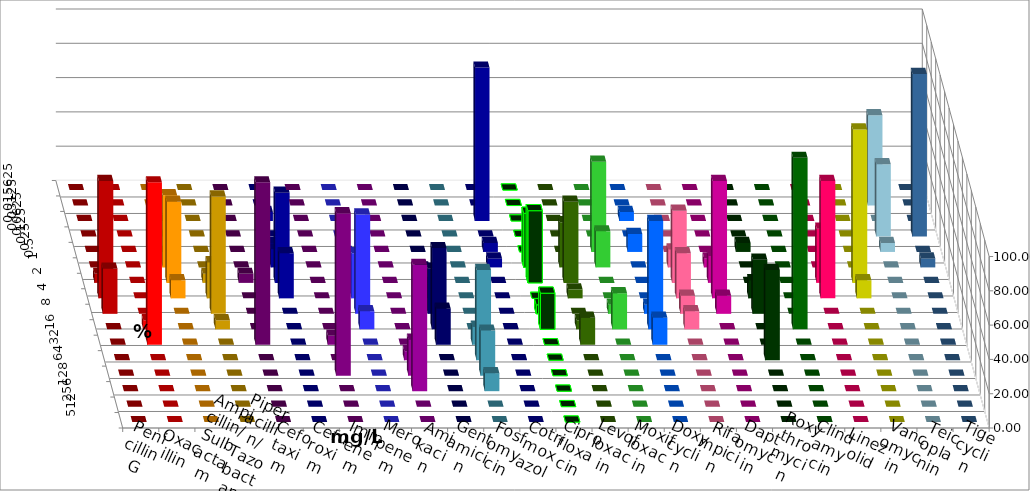
| Category | Penicillin G | Oxacillin | Ampicillin/ Sulbactam | Piperacillin/ Tazobactam | Cefotaxim | Cefuroxim | Imipenem | Meropenem | Amikacin | Gentamicin | Fosfomycin | Cotrimoxazol | Ciprofloxacin | Levofloxacin | Moxifloxacin | Doxycyclin | Rifampicin | Daptomycin | Roxythromycin | Clindamycin | Linezolid | Vancomycin | Teicoplanin | Tigecyclin |
|---|---|---|---|---|---|---|---|---|---|---|---|---|---|---|---|---|---|---|---|---|---|---|---|---|
| 0.015625 | 0 | 0 | 0 | 0 | 0 | 0 | 0 | 0 | 0 | 0 | 0 | 0 | 0 | 0 | 0 | 0 | 0 | 0 | 0 | 0 | 0 | 0 | 0 | 0 |
| 0.03125 | 0 | 0 | 0 | 0 | 0 | 0 | 0 | 0 | 0 | 0 | 0 | 0 | 0 | 0 | 0 | 0 | 0 | 0 | 0 | 0 | 0 | 0 | 0 | 52.632 |
| 0.0625 | 0 | 0 | 0 | 0 | 0 | 0 | 5.263 | 0 | 0 | 0 | 0 | 89.474 | 0 | 0 | 0 | 5.263 | 0 | 0 | 0 | 0 | 0 | 0 | 0 | 0 |
| 0.125 | 0 | 0 | 0 | 0 | 0 | 0 | 0 | 0 | 0 | 0 | 0 | 0 | 0 | 0 | 0 | 0 | 0 | 0 | 0 | 0 | 0 | 0 | 94.737 | 42.105 |
| 0.25 | 0 | 0 | 0 | 0 | 0 | 0 | 5.263 | 0 | 0 | 0 | 0 | 5.263 | 0 | 0 | 52.632 | 10.526 | 0 | 0 | 5.263 | 0 | 0 | 0 | 0 | 5.263 |
| 0.5 | 0 | 0 | 42.105 | 0 | 0 | 0 | 10.526 | 0 | 0 | 0 | 0 | 5.263 | 31.579 | 26.316 | 21.053 | 0 | 10.526 | 5.263 | 0 | 0 | 0 | 0 | 5.263 | 0 |
| 1.0 | 5.263 | 0 | 47.368 | 5.263 | 5.263 | 0 | 52.632 | 5.263 | 0 | 0 | 0 | 0 | 42.105 | 47.368 | 0 | 0 | 42.105 | 15.789 | 0 | 0 | 31.579 | 89.474 | 0 | 0 |
| 2.0 | 68.421 | 0 | 10.526 | 21.053 | 0 | 0 | 26.316 | 26.316 | 0 | 5.263 | 0 | 0 | 0 | 5.263 | 0 | 0 | 26.316 | 68.421 | 10.526 | 0 | 68.421 | 10.526 | 0 | 0 |
| 4.0 | 26.316 | 0 | 0 | 68.421 | 0 | 0 | 0 | 57.895 | 0 | 26.316 | 0 | 0 | 5.263 | 0 | 5.263 | 5.263 | 10.526 | 10.526 | 31.579 | 0 | 0 | 0 | 0 | 0 |
| 8.0 | 0 | 5.263 | 0 | 5.263 | 0 | 0 | 0 | 10.526 | 0 | 47.368 | 0 | 0 | 21.053 | 5.263 | 21.053 | 63.158 | 10.526 | 0 | 0 | 100 | 0 | 0 | 0 | 0 |
| 16.0 | 0 | 94.737 | 0 | 0 | 94.737 | 5.263 | 0 | 0 | 0 | 21.053 | 10.526 | 0 | 0 | 15.789 | 0 | 15.789 | 0 | 0 | 0 | 0 | 0 | 0 | 0 | 0 |
| 32.0 | 0 | 0 | 0 | 0 | 0 | 0 | 0 | 0 | 5.263 | 0 | 52.632 | 0 | 0 | 0 | 0 | 0 | 0 | 0 | 52.632 | 0 | 0 | 0 | 0 | 0 |
| 64.0 | 0 | 0 | 0 | 0 | 0 | 94.737 | 0 | 0 | 21.053 | 0 | 26.316 | 0 | 0 | 0 | 0 | 0 | 0 | 0 | 0 | 0 | 0 | 0 | 0 | 0 |
| 128.0 | 0 | 0 | 0 | 0 | 0 | 0 | 0 | 0 | 73.684 | 0 | 10.526 | 0 | 0 | 0 | 0 | 0 | 0 | 0 | 0 | 0 | 0 | 0 | 0 | 0 |
| 256.0 | 0 | 0 | 0 | 0 | 0 | 0 | 0 | 0 | 0 | 0 | 0 | 0 | 0 | 0 | 0 | 0 | 0 | 0 | 0 | 0 | 0 | 0 | 0 | 0 |
| 512.0 | 0 | 0 | 0 | 0 | 0 | 0 | 0 | 0 | 0 | 0 | 0 | 0 | 0 | 0 | 0 | 0 | 0 | 0 | 0 | 0 | 0 | 0 | 0 | 0 |